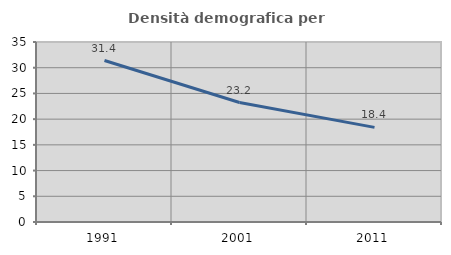
| Category | Densità demografica |
|---|---|
| 1991.0 | 31.401 |
| 2001.0 | 23.226 |
| 2011.0 | 18.395 |